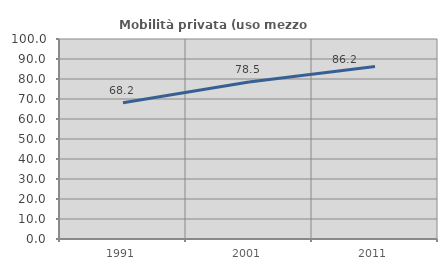
| Category | Mobilità privata (uso mezzo privato) |
|---|---|
| 1991.0 | 68.168 |
| 2001.0 | 78.465 |
| 2011.0 | 86.243 |